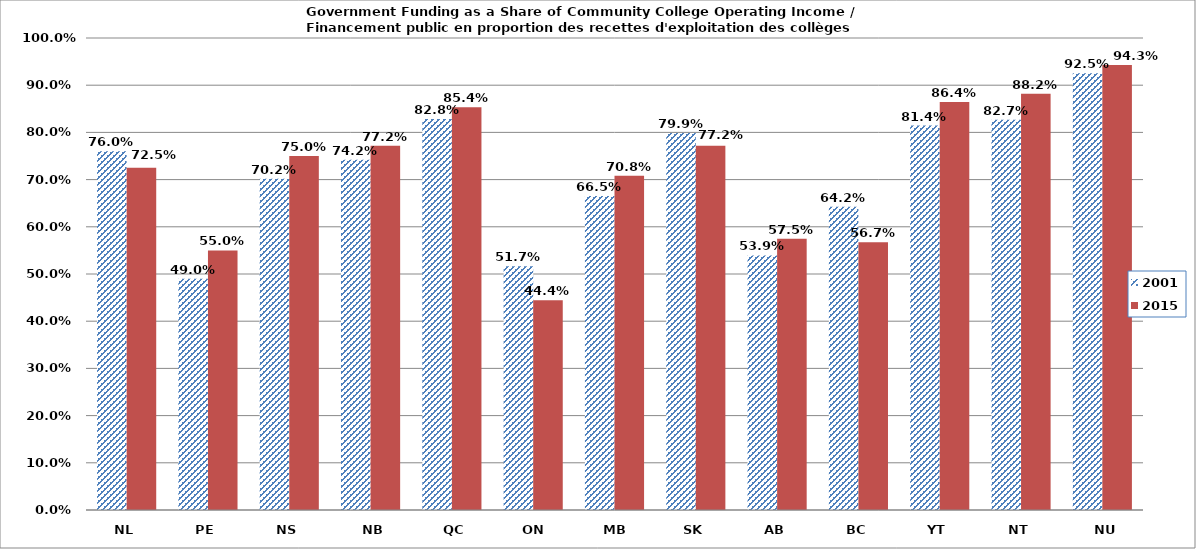
| Category | 2001 | 2015 |
|---|---|---|
| NL | 0.76 | 0.725 |
| PE | 0.49 | 0.55 |
| NS | 0.702 | 0.75 |
| NB | 0.742 | 0.772 |
| QC | 0.828 | 0.854 |
| ON | 0.517 | 0.444 |
| MB | 0.665 | 0.708 |
| SK | 0.799 | 0.772 |
| AB | 0.539 | 0.575 |
| BC | 0.642 | 0.567 |
| YT | 0.814 | 0.864 |
| NT | 0.827 | 0.882 |
| NU | 0.925 | 0.943 |